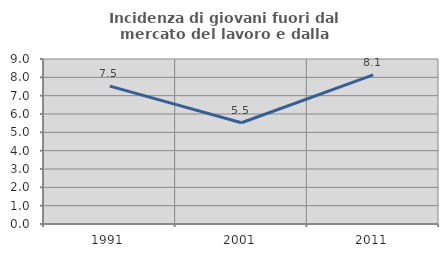
| Category | Incidenza di giovani fuori dal mercato del lavoro e dalla formazione  |
|---|---|
| 1991.0 | 7.52 |
| 2001.0 | 5.525 |
| 2011.0 | 8.134 |